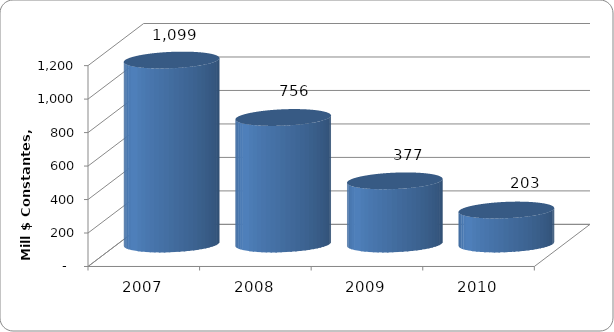
| Category | SALDO DE DEUDA |
|---|---|
| 2007 | 1098.994 |
| 2008 | 755.866 |
| 2009 | 377.329 |
| 2010 | 202.901 |